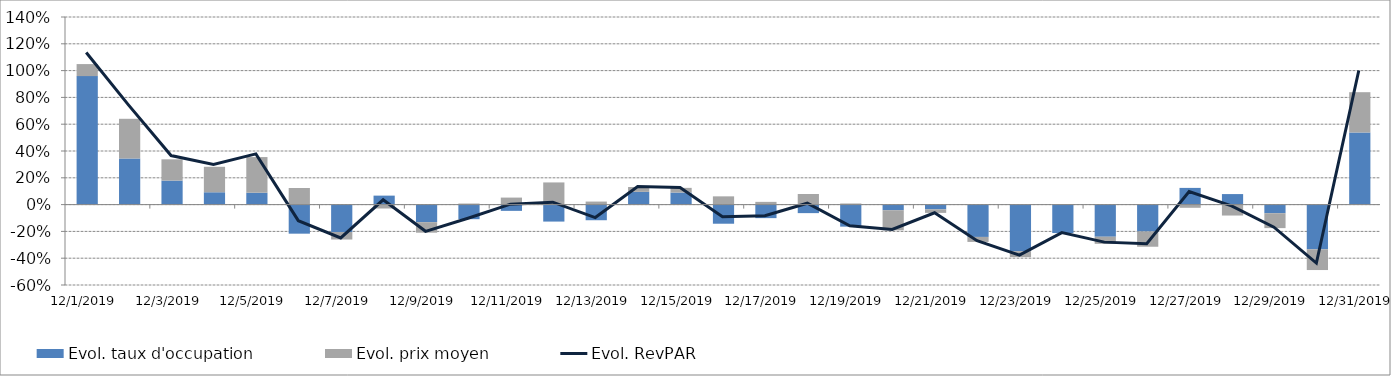
| Category | Evol. taux d'occupation | Evol. prix moyen |
|---|---|---|
| 12/1/19 | 0.959 | 0.09 |
| 12/2/19 | 0.344 | 0.296 |
| 12/3/19 | 0.179 | 0.159 |
| 12/4/19 | 0.092 | 0.19 |
| 12/5/19 | 0.089 | 0.266 |
| 12/6/19 | -0.217 | 0.124 |
| 12/7/19 | -0.204 | -0.056 |
| 12/8/19 | 0.067 | -0.029 |
| 12/9/19 | -0.131 | -0.078 |
| 12/10/19 | -0.109 | 0.008 |
| 12/11/19 | -0.047 | 0.052 |
| 12/12/19 | -0.127 | 0.165 |
| 12/13/19 | -0.117 | 0.023 |
| 12/14/19 | 0.095 | 0.036 |
| 12/15/19 | 0.09 | 0.035 |
| 12/16/19 | -0.143 | 0.062 |
| 12/17/19 | -0.101 | 0.02 |
| 12/18/19 | -0.064 | 0.079 |
| 12/19/19 | -0.165 | 0.008 |
| 12/20/19 | -0.042 | -0.15 |
| 12/21/19 | -0.035 | -0.027 |
| 12/22/19 | -0.241 | -0.037 |
| 12/23/19 | -0.348 | -0.045 |
| 12/24/19 | -0.212 | 0.004 |
| 12/25/19 | -0.24 | -0.053 |
| 12/26/19 | -0.2 | -0.114 |
| 12/27/19 | 0.125 | -0.024 |
| 12/28/19 | 0.079 | -0.082 |
| 12/29/19 | -0.064 | -0.111 |
| 12/30/19 | -0.333 | -0.155 |
| 12/31/19 | 0.538 | 0.301 |